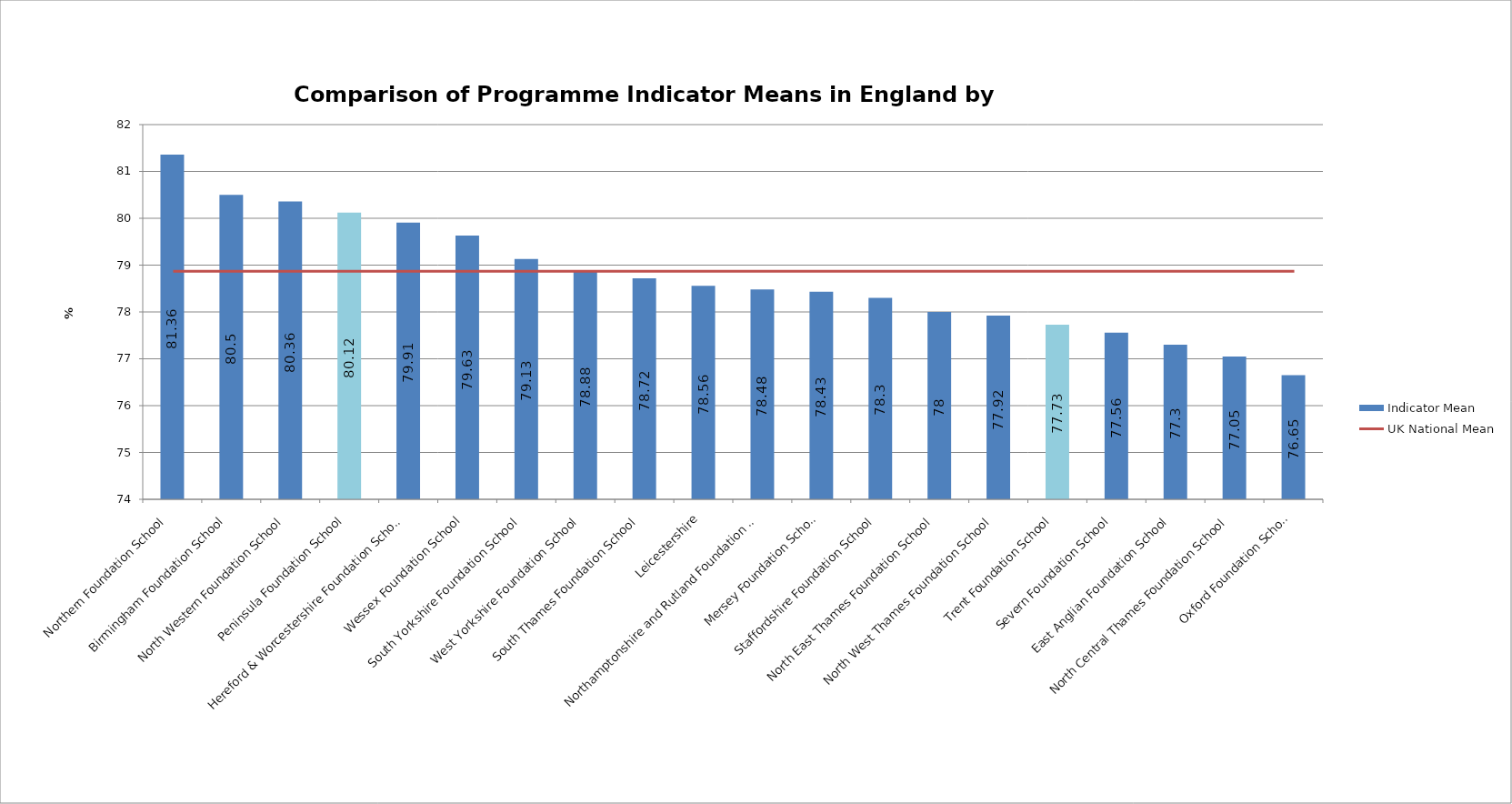
| Category | Indicator Mean |
|---|---|
| Northern Foundation School | 81.36 |
| Birmingham Foundation School | 80.5 |
| North Western Foundation School | 80.36 |
| Peninsula Foundation School | 80.12 |
| Hereford & Worcestershire Foundation School | 79.91 |
| Wessex Foundation School | 79.63 |
| South Yorkshire Foundation School | 79.13 |
| West Yorkshire Foundation School | 78.88 |
| South Thames Foundation School | 78.72 |
| Leicestershire, Northamptonshire and Rutland Foundation School | 78.56 |
| Mersey Foundation School | 78.48 |
| Staffordshire Foundation School | 78.43 |
| North East Thames Foundation School | 78.3 |
| North West Thames Foundation School | 78 |
| Trent Foundation School | 77.92 |
| Severn Foundation School | 77.73 |
| East Anglian Foundation School | 77.56 |
| North Central Thames Foundation School | 77.3 |
| Oxford Foundation School | 77.05 |
| North Yorkshire East Coast Foundation School | 76.65 |